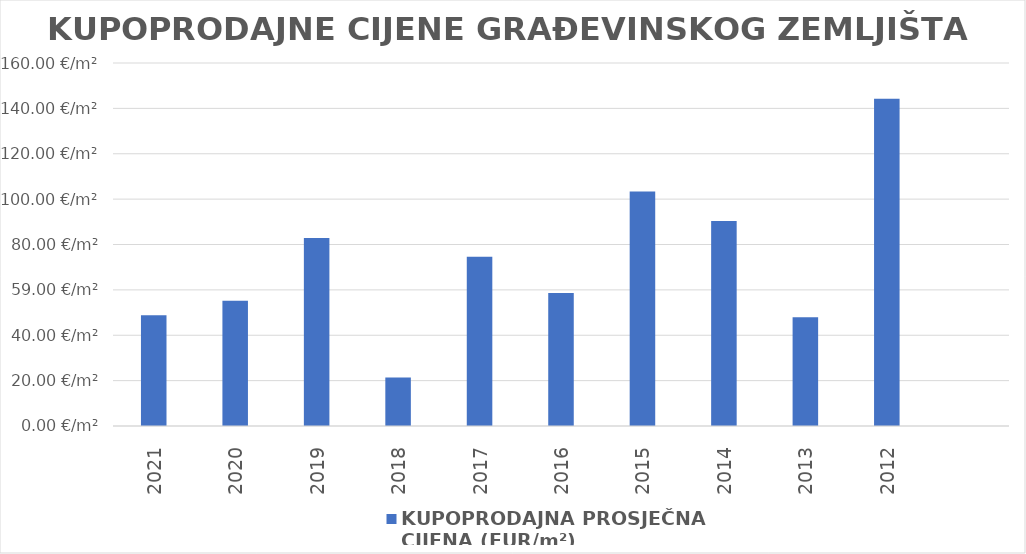
| Category | KUPOPRODAJNA PROSJEČNA 
CIJENA (EUR/m²) |
|---|---|
| 2021 | 1900-02-17 20:21:17 |
| 2020 | 1900-02-24 05:29:24 |
| 2019 | 1900-03-22 20:20:49 |
| 2018 | 1900-01-21 07:44:51 |
| 2017 | 1900-03-14 15:28:53 |
| 2016 | 1900-02-27 14:50:45 |
| 2015 | 1900-04-12 09:45:40 |
| 2014 | 1900-03-30 09:53:42 |
| 2013 | 1900-02-16 22:50:36 |
| 2012 | 1900-05-23 05:36:13 |